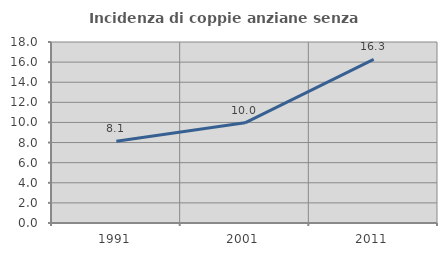
| Category | Incidenza di coppie anziane senza figli  |
|---|---|
| 1991.0 | 8.122 |
| 2001.0 | 9.96 |
| 2011.0 | 16.263 |